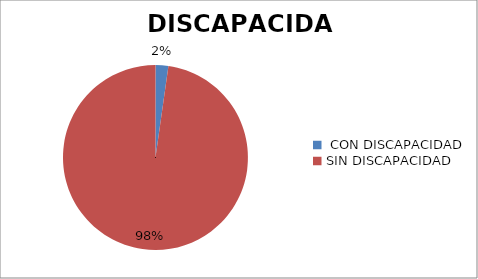
| Category | Series 0 | Series 1 |
|---|---|---|
|  CON DISCAPACIDAD  | 830 |  |
| SIN DISCAPACIDAD  | 36267 |  |